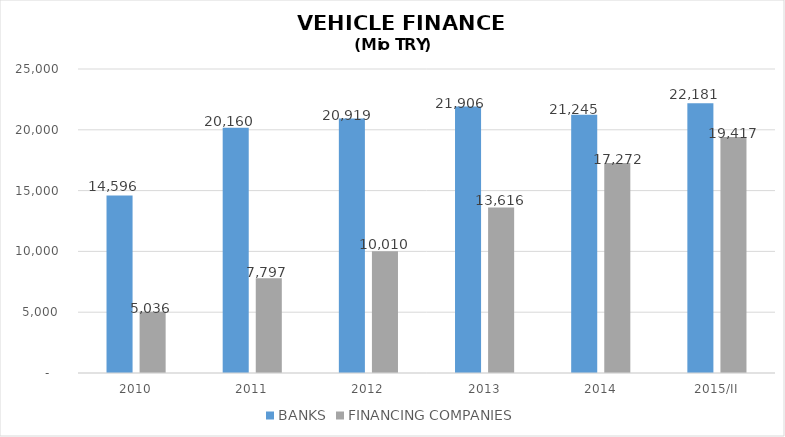
| Category | BANKS | FINANCING COMPANIES |
|---|---|---|
| 2010 | 14596 | 5035.89 |
| 2011 | 20160 | 7796.854 |
| 2012 | 20919 | 10009.755 |
| 2013 | 21906 | 13616.036 |
| 2014 | 21245 | 17271.844 |
| 2015/II | 22181 | 19416.865 |